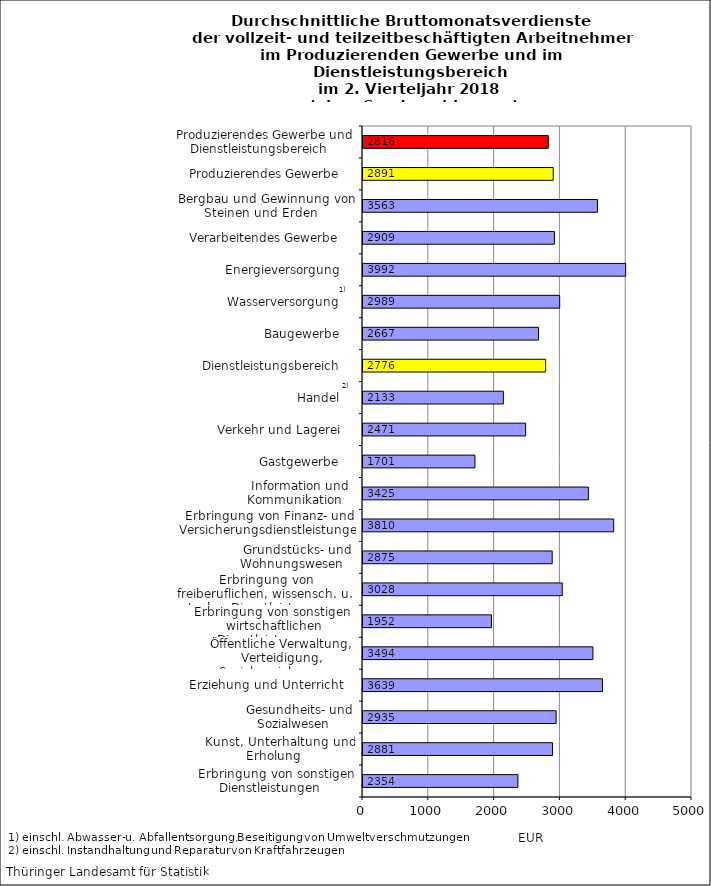
| Category | Series 0 |
|---|---|
| Erbringung von sonstigen Dienstleistungen    | 2354 |
| Kunst, Unterhaltung und Erholung    | 2881 |
| Gesundheits- und Sozialwesen    | 2935 |
| Erziehung und Unterricht    | 3639 |
| Öffentliche Verwaltung, Verteidigung, Sozialversicherung    | 3494 |
| Erbringung von sonstigen  wirtschaftlichen Dienstleistungen    | 1952 |
| Erbringung von freiberuflichen, wissensch. u. techn. Dienstleistungen    | 3028 |
| Grundstücks- und Wohnungswesen    | 2875 |
| Erbringung von Finanz- und Versicherungsdienstleistungen    | 3810 |
| Information und Kommunikation    | 3425 |
| Gastgewerbe    | 1701 |
| Verkehr und Lagerei    | 2471 |
| Handel    | 2133 |
| Dienstleistungsbereich    | 2776 |
| Baugewerbe    | 2667 |
| Wasserversorgung    | 2989 |
| Energieversorgung    | 3992 |
| Verarbeitendes Gewerbe    | 2909 |
| Bergbau und Gewinnung von Steinen und Erden    | 3563 |
| Produzierendes Gewerbe    | 2891 |
| Produzierendes Gewerbe und Dienstleistungsbereich    | 2816 |